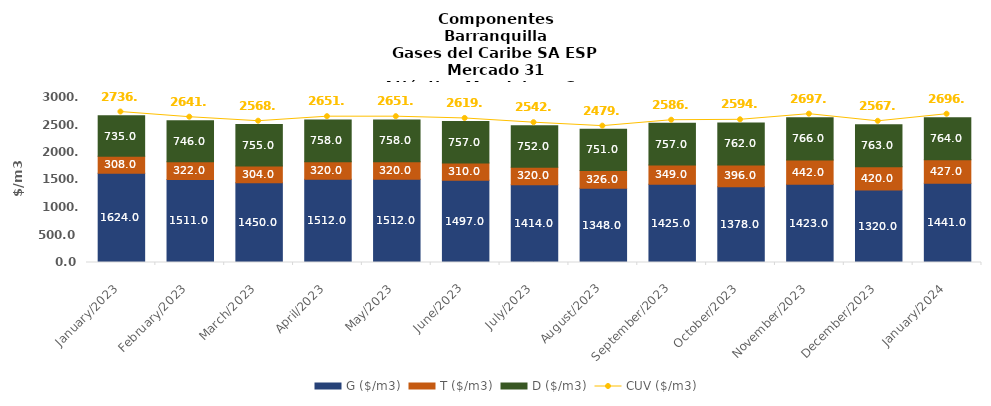
| Category | G ($/m3) | T ($/m3) | D ($/m3) |
|---|---|---|---|
| 2023-01-01 | 1624 | 308 | 735 |
| 2023-02-01 | 1511 | 322 | 746 |
| 2023-03-01 | 1450 | 304 | 755 |
| 2023-04-01 | 1512 | 320 | 758 |
| 2023-05-01 | 1512 | 320 | 758 |
| 2023-06-01 | 1497 | 310 | 757 |
| 2023-07-01 | 1414 | 320 | 752 |
| 2023-08-01 | 1348 | 326 | 751 |
| 2023-09-01 | 1425 | 349 | 757 |
| 2023-10-01 | 1378 | 396 | 762 |
| 2023-11-01 | 1423 | 442 | 766 |
| 2023-12-01 | 1320 | 420 | 763 |
| 2024-01-01 | 1441 | 427 | 764 |